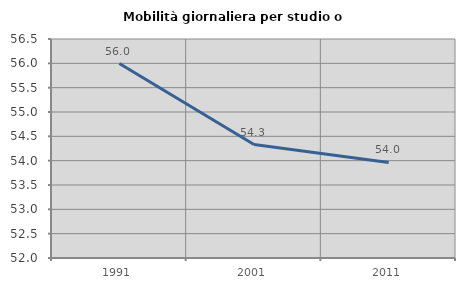
| Category | Mobilità giornaliera per studio o lavoro |
|---|---|
| 1991.0 | 55.995 |
| 2001.0 | 54.331 |
| 2011.0 | 53.964 |